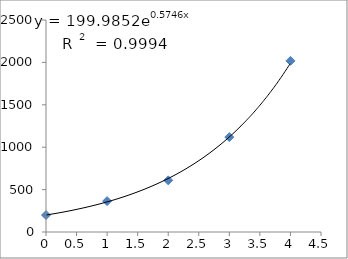
| Category | Series 0 |
|---|---|
| 0.0 | 200 |
| 1.0 | 364 |
| 2.0 | 609 |
| 3.0 | 1119 |
| 4.0 | 2018 |